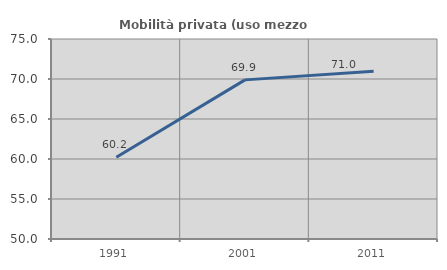
| Category | Mobilità privata (uso mezzo privato) |
|---|---|
| 1991.0 | 60.223 |
| 2001.0 | 69.891 |
| 2011.0 | 70.966 |